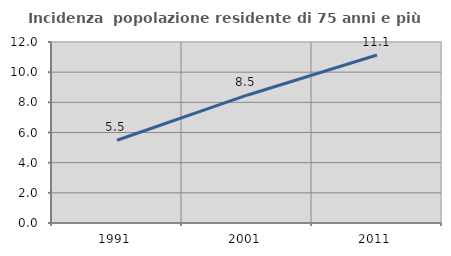
| Category | Incidenza  popolazione residente di 75 anni e più |
|---|---|
| 1991.0 | 5.486 |
| 2001.0 | 8.473 |
| 2011.0 | 11.136 |